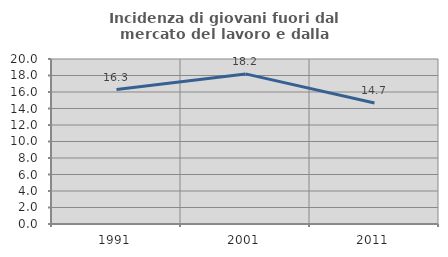
| Category | Incidenza di giovani fuori dal mercato del lavoro e dalla formazione  |
|---|---|
| 1991.0 | 16.293 |
| 2001.0 | 18.193 |
| 2011.0 | 14.67 |